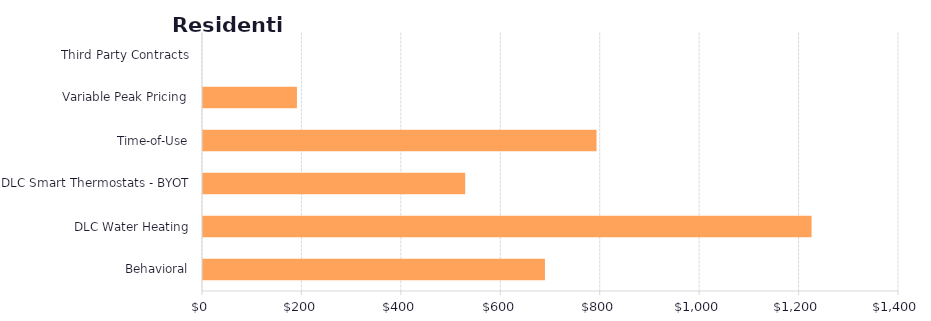
| Category | Series 1 |
|---|---|
| Behavioral | 687.839 |
| DLC Water Heating | 1224.172 |
| DLC Smart Thermostats - BYOT | 527.404 |
| Time-of-Use | 791.587 |
| Variable Peak Pricing | 188.945 |
| Third Party Contracts | 0 |